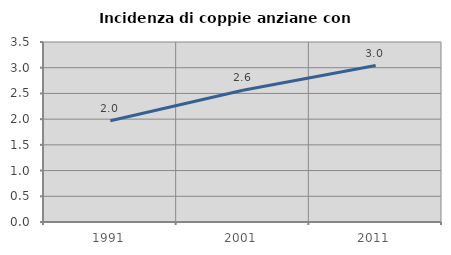
| Category | Incidenza di coppie anziane con figli |
|---|---|
| 1991.0 | 1.97 |
| 2001.0 | 2.561 |
| 2011.0 | 3.043 |